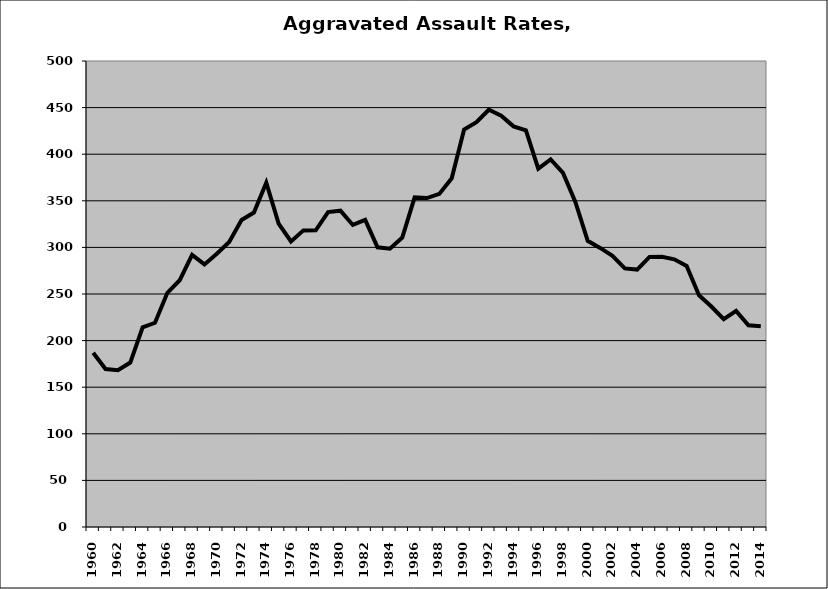
| Category | Aggravated Assault |
|---|---|
| 1960.0 | 187 |
| 1961.0 | 169.506 |
| 1962.0 | 168.294 |
| 1963.0 | 176.429 |
| 1964.0 | 214.18 |
| 1965.0 | 219.109 |
| 1966.0 | 251.3 |
| 1967.0 | 264.784 |
| 1968.0 | 291.938 |
| 1969.0 | 281.768 |
| 1970.0 | 293.169 |
| 1971.0 | 305.83 |
| 1972.0 | 329.344 |
| 1973.0 | 337.379 |
| 1974.0 | 369.383 |
| 1975.0 | 325.628 |
| 1976.0 | 306.363 |
| 1977.0 | 318.262 |
| 1978.0 | 318.397 |
| 1979.0 | 337.941 |
| 1980.0 | 339.445 |
| 1981.0 | 324.063 |
| 1982.0 | 329.457 |
| 1983.0 | 300.049 |
| 1984.0 | 298.524 |
| 1985.0 | 310.568 |
| 1986.0 | 353.641 |
| 1987.0 | 352.939 |
| 1988.0 | 357.416 |
| 1989.0 | 374.129 |
| 1990.0 | 426.438 |
| 1991.0 | 434.392 |
| 1992.0 | 447.728 |
| 1993.0 | 441.325 |
| 1994.0 | 429.859 |
| 1995.0 | 425.504 |
| 1996.0 | 384.528 |
| 1997.0 | 394.505 |
| 1998.0 | 379.897 |
| 1999.0 | 348.722 |
| 2000.0 | 307.045 |
| 2001.0 | 299.448 |
| 2002.0 | 290.989 |
| 2003.0 | 277.502 |
| 2004.0 | 276.226 |
| 2005.0 | 289.745 |
| 2006.0 | 290.002 |
| 2007.0 | 287.186 |
| 2008.0 | 280.13 |
| 2009.0 | 248.655 |
| 2010.0 | 236.527 |
| 2011.0 | 222.938 |
| 2012.0 | 231.926 |
| 2013.0 | 216.521 |
| 2014.0 | 215.417 |